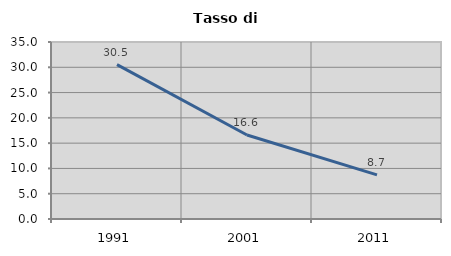
| Category | Tasso di disoccupazione   |
|---|---|
| 1991.0 | 30.516 |
| 2001.0 | 16.619 |
| 2011.0 | 8.73 |